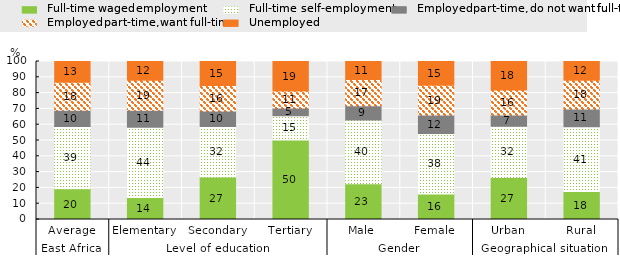
| Category | Full-time waged employment | Full-time self-employment | Employed part-time, do not want full-time | Employed part-time, want full-time | Unemployed  |
|---|---|---|---|---|---|
| 0 | 19.514 | 39.292 | 10.289 | 17.754 | 13.152 |
| 1 | 13.935 | 44.467 | 10.804 | 18.992 | 11.803 |
| 2 | 26.894 | 31.984 | 9.853 | 16.085 | 15.184 |
| 3 | 50.375 | 15.284 | 4.874 | 10.843 | 18.623 |
| 4 | 22.654 | 40.336 | 8.976 | 16.684 | 11.351 |
| 5 | 16.218 | 38.197 | 11.666 | 18.877 | 15.042 |
| 6 | 26.641 | 32.329 | 7.148 | 15.806 | 18.077 |
| 7 | 17.669 | 41.095 | 11.102 | 18.258 | 11.876 |